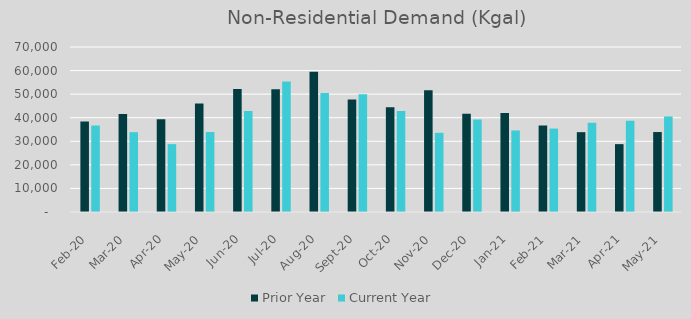
| Category | Prior Year | Current Year |
|---|---|---|
| 2020-02-01 | 38439 | 36720 |
| 2020-03-01 | 41545 | 33872 |
| 2020-04-01 | 39390 | 28794 |
| 2020-05-01 | 46068 | 33923 |
| 2020-06-01 | 52164 | 42862 |
| 2020-07-01 | 52094 | 55350 |
| 2020-08-01 | 59449 | 50435 |
| 2020-09-01 | 47706 | 49956 |
| 2020-10-01 | 44393 | 42806 |
| 2020-11-01 | 51699 | 33597 |
| 2020-12-01 | 41635 | 39277 |
| 2021-01-01 | 42003 | 34595 |
| 2021-02-01 | 36720 | 35390 |
| 2021-03-01 | 33872 | 37846 |
| 2021-04-01 | 28794 | 38666 |
| 2021-05-01 | 33923 | 40521 |